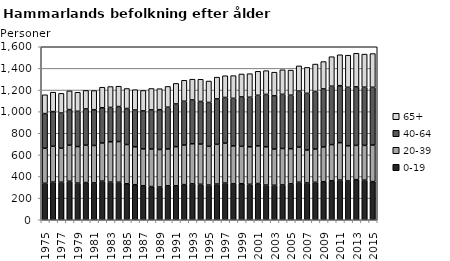
| Category | 0-19 | 20-39 | 40-64 | 65+ |
|---|---|---|---|---|
| 1975.0 | 337 | 325 | 320 | 174 |
| 1976.0 | 348 | 332 | 320 | 180 |
| 1977.0 | 347 | 315 | 325 | 182 |
| 1978.0 | 356 | 334 | 329 | 173 |
| 1979.0 | 339 | 338 | 326 | 176 |
| 1980.0 | 344 | 346 | 335 | 171 |
| 1981.0 | 341 | 346 | 331 | 177 |
| 1982.0 | 357 | 353 | 326 | 190 |
| 1983.0 | 348 | 373 | 318 | 193 |
| 1984.0 | 347 | 376 | 324 | 188 |
| 1985.0 | 333 | 363 | 333 | 185 |
| 1986.0 | 324 | 351 | 340 | 188 |
| 1987.0 | 314 | 342 | 351 | 189 |
| 1988.0 | 307 | 347 | 362 | 198 |
| 1989.0 | 303 | 347 | 368 | 194 |
| 1990.0 | 314 | 341 | 386 | 192 |
| 1991.0 | 314 | 362 | 395 | 190 |
| 1992.0 | 325 | 366 | 405 | 194 |
| 1993.0 | 332 | 371 | 405 | 192 |
| 1994.0 | 328 | 372 | 394 | 205 |
| 1995.0 | 321 | 358 | 406 | 198 |
| 1996.0 | 330 | 368 | 420 | 201 |
| 1997.0 | 339 | 369 | 423 | 201 |
| 1998.0 | 332 | 351 | 440 | 210 |
| 1999.0 | 333 | 346 | 457 | 212 |
| 2000.0 | 328 | 347 | 458 | 218 |
| 2001.0 | 335 | 348 | 468 | 222 |
| 2002.0 | 321 | 354 | 484 | 220 |
| 2003.0 | 319 | 335 | 492 | 219 |
| 2004.0 | 322 | 337 | 501 | 227 |
| 2005.0 | 332 | 325 | 495 | 232 |
| 2006.0 | 347 | 325 | 518 | 233 |
| 2007.0 | 340 | 305 | 524 | 240 |
| 2008.0 | 346 | 308 | 533 | 253 |
| 2009.0 | 351 | 322 | 537 | 253 |
| 2010.0 | 360 | 335 | 540 | 273 |
| 2011.0 | 367 | 346 | 527 | 286 |
| 2012.0 | 359 | 325 | 541 | 297 |
| 2013.0 | 371 | 317 | 541 | 311 |
| 2014.0 | 366 | 322 | 538 | 306 |
| 2015.0 | 353 | 338 | 534 | 312 |